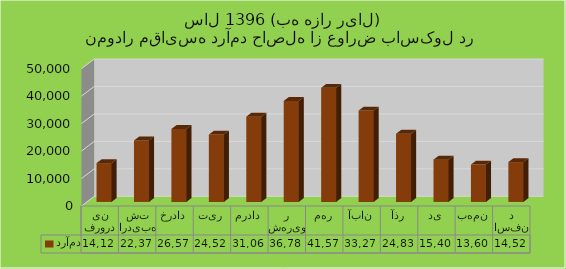
| Category | درآمد |
|---|---|
| فروردین | 14125 |
| اردیبهشت | 22377 |
| خرداد | 26577 |
| تیر | 24527 |
| مرداد | 31060 |
| شهریور | 36780 |
| مهر | 41570 |
| آبان | 33272 |
| آذر | 24839 |
| دی | 15402 |
| بهمن | 13608 |
| اسفند | 14521 |